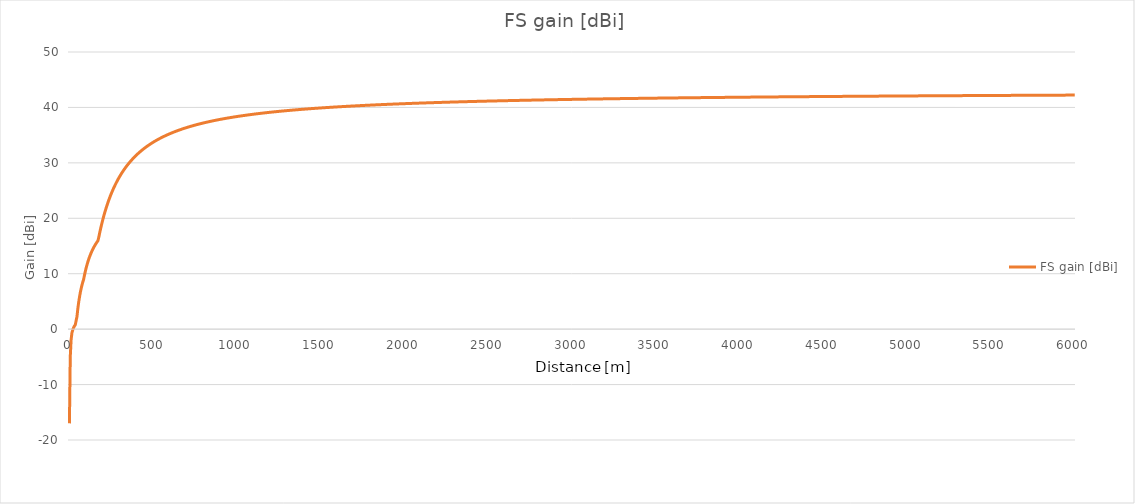
| Category | FS gain [dBi] |
|---|---|
| 0.0 | -17 |
| 5.0 | -5.017 |
| 10.0 | -1.946 |
| 15.0 | -0.667 |
| 20.0 | -0.125 |
| 25.0 | 0.269 |
| 30.0 | 0.562 |
| 35.0 | 0.787 |
| 40.0 | 0.963 |
| 45.0 | 2.252 |
| 50.0 | 3.641 |
| 55.0 | 4.796 |
| 60.0 | 5.771 |
| 65.0 | 6.604 |
| 70.0 | 7.324 |
| 75.0 | 7.952 |
| 80.0 | 8.504 |
| 85.0 | 8.994 |
| 90.0 | 9.753 |
| 95.0 | 10.438 |
| 100.0 | 11.057 |
| 105.0 | 11.618 |
| 110.0 | 12.129 |
| 115.0 | 12.596 |
| 120.0 | 13.025 |
| 125.0 | 13.42 |
| 130.0 | 13.785 |
| 135.0 | 14.124 |
| 140.0 | 14.438 |
| 145.0 | 14.731 |
| 150.0 | 15.005 |
| 155.0 | 15.261 |
| 160.0 | 15.502 |
| 165.0 | 15.728 |
| 170.0 | 15.941 |
| 175.0 | 16.545 |
| 180.0 | 17.276 |
| 185.0 | 17.968 |
| 190.0 | 18.624 |
| 195.0 | 19.247 |
| 200.0 | 19.839 |
| 205.0 | 20.401 |
| 210.0 | 20.938 |
| 215.0 | 21.449 |
| 220.0 | 21.937 |
| 225.0 | 22.404 |
| 230.0 | 22.85 |
| 235.0 | 23.278 |
| 240.0 | 23.688 |
| 245.0 | 24.081 |
| 250.0 | 24.458 |
| 255.0 | 24.821 |
| 260.0 | 25.17 |
| 265.0 | 25.506 |
| 270.0 | 25.829 |
| 275.0 | 26.14 |
| 280.0 | 26.441 |
| 285.0 | 26.731 |
| 290.0 | 27.011 |
| 295.0 | 27.281 |
| 300.0 | 27.543 |
| 305.0 | 27.796 |
| 310.0 | 28.041 |
| 315.0 | 28.278 |
| 320.0 | 28.508 |
| 325.0 | 28.73 |
| 330.0 | 28.946 |
| 335.0 | 29.156 |
| 340.0 | 29.359 |
| 345.0 | 29.556 |
| 350.0 | 29.748 |
| 355.0 | 29.935 |
| 360.0 | 30.116 |
| 365.0 | 30.292 |
| 370.0 | 30.464 |
| 375.0 | 30.631 |
| 380.0 | 30.793 |
| 385.0 | 30.952 |
| 390.0 | 31.106 |
| 395.0 | 31.256 |
| 400.0 | 31.403 |
| 405.0 | 31.546 |
| 410.0 | 31.686 |
| 415.0 | 31.822 |
| 420.0 | 31.955 |
| 425.0 | 32.085 |
| 430.0 | 32.211 |
| 435.0 | 32.335 |
| 440.0 | 32.456 |
| 445.0 | 32.575 |
| 450.0 | 32.691 |
| 455.0 | 32.804 |
| 460.0 | 32.915 |
| 465.0 | 33.023 |
| 470.0 | 33.129 |
| 475.0 | 33.233 |
| 480.0 | 33.334 |
| 485.0 | 33.434 |
| 490.0 | 33.532 |
| 495.0 | 33.627 |
| 500.0 | 33.721 |
| 505.0 | 33.813 |
| 510.0 | 33.903 |
| 515.0 | 33.991 |
| 520.0 | 34.078 |
| 525.0 | 34.162 |
| 530.0 | 34.246 |
| 535.0 | 34.328 |
| 540.0 | 34.408 |
| 545.0 | 34.487 |
| 550.0 | 34.564 |
| 555.0 | 34.64 |
| 560.0 | 34.715 |
| 565.0 | 34.788 |
| 570.0 | 34.86 |
| 575.0 | 34.931 |
| 580.0 | 35 |
| 585.0 | 35.068 |
| 590.0 | 35.136 |
| 595.0 | 35.202 |
| 600.0 | 35.267 |
| 605.0 | 35.331 |
| 610.0 | 35.393 |
| 615.0 | 35.455 |
| 620.0 | 35.516 |
| 625.0 | 35.576 |
| 630.0 | 35.635 |
| 635.0 | 35.693 |
| 640.0 | 35.75 |
| 645.0 | 35.806 |
| 650.0 | 35.861 |
| 655.0 | 35.916 |
| 660.0 | 35.969 |
| 665.0 | 36.022 |
| 670.0 | 36.074 |
| 675.0 | 36.126 |
| 680.0 | 36.176 |
| 685.0 | 36.226 |
| 690.0 | 36.275 |
| 695.0 | 36.323 |
| 700.0 | 36.371 |
| 705.0 | 36.418 |
| 710.0 | 36.464 |
| 715.0 | 36.51 |
| 720.0 | 36.555 |
| 725.0 | 36.6 |
| 730.0 | 36.643 |
| 735.0 | 36.687 |
| 740.0 | 36.729 |
| 745.0 | 36.771 |
| 750.0 | 36.813 |
| 755.0 | 36.854 |
| 760.0 | 36.894 |
| 765.0 | 36.934 |
| 770.0 | 36.974 |
| 775.0 | 37.012 |
| 780.0 | 37.051 |
| 785.0 | 37.089 |
| 790.0 | 37.126 |
| 795.0 | 37.163 |
| 800.0 | 37.199 |
| 805.0 | 37.236 |
| 810.0 | 37.271 |
| 815.0 | 37.306 |
| 820.0 | 37.341 |
| 825.0 | 37.375 |
| 830.0 | 37.409 |
| 835.0 | 37.443 |
| 840.0 | 37.476 |
| 845.0 | 37.508 |
| 850.0 | 37.541 |
| 855.0 | 37.573 |
| 860.0 | 37.604 |
| 865.0 | 37.635 |
| 870.0 | 37.666 |
| 875.0 | 37.697 |
| 880.0 | 37.727 |
| 885.0 | 37.756 |
| 890.0 | 37.786 |
| 895.0 | 37.815 |
| 900.0 | 37.844 |
| 905.0 | 37.872 |
| 910.0 | 37.901 |
| 915.0 | 37.928 |
| 920.0 | 37.956 |
| 925.0 | 37.983 |
| 930.0 | 38.01 |
| 935.0 | 38.037 |
| 940.0 | 38.063 |
| 945.0 | 38.089 |
| 950.0 | 38.115 |
| 955.0 | 38.141 |
| 960.0 | 38.166 |
| 965.0 | 38.191 |
| 970.0 | 38.216 |
| 975.0 | 38.24 |
| 980.0 | 38.265 |
| 985.0 | 38.289 |
| 990.0 | 38.313 |
| 995.0 | 38.336 |
| 1000.0 | 38.359 |
| 1005.0 | 38.382 |
| 1010.0 | 38.405 |
| 1015.0 | 38.428 |
| 1020.0 | 38.45 |
| 1025.0 | 38.473 |
| 1030.0 | 38.495 |
| 1035.0 | 38.516 |
| 1040.0 | 38.538 |
| 1045.0 | 38.559 |
| 1050.0 | 38.58 |
| 1055.0 | 38.601 |
| 1060.0 | 38.622 |
| 1065.0 | 38.643 |
| 1070.0 | 38.663 |
| 1075.0 | 38.683 |
| 1080.0 | 38.703 |
| 1085.0 | 38.723 |
| 1090.0 | 38.743 |
| 1095.0 | 38.762 |
| 1100.0 | 38.781 |
| 1105.0 | 38.8 |
| 1110.0 | 38.819 |
| 1115.0 | 38.838 |
| 1120.0 | 38.857 |
| 1125.0 | 38.875 |
| 1130.0 | 38.893 |
| 1135.0 | 38.911 |
| 1140.0 | 38.929 |
| 1145.0 | 38.947 |
| 1150.0 | 38.965 |
| 1155.0 | 38.982 |
| 1160.0 | 38.999 |
| 1165.0 | 39.017 |
| 1170.0 | 39.034 |
| 1175.0 | 39.05 |
| 1180.0 | 39.067 |
| 1185.0 | 39.084 |
| 1190.0 | 39.1 |
| 1195.0 | 39.117 |
| 1200.0 | 39.133 |
| 1205.0 | 39.149 |
| 1210.0 | 39.165 |
| 1215.0 | 39.18 |
| 1220.0 | 39.196 |
| 1225.0 | 39.212 |
| 1230.0 | 39.227 |
| 1235.0 | 39.242 |
| 1240.0 | 39.257 |
| 1245.0 | 39.273 |
| 1250.0 | 39.287 |
| 1255.0 | 39.302 |
| 1260.0 | 39.317 |
| 1265.0 | 39.331 |
| 1270.0 | 39.346 |
| 1275.0 | 39.36 |
| 1280.0 | 39.374 |
| 1285.0 | 39.389 |
| 1290.0 | 39.403 |
| 1295.0 | 39.416 |
| 1300.0 | 39.43 |
| 1305.0 | 39.444 |
| 1310.0 | 39.457 |
| 1315.0 | 39.471 |
| 1320.0 | 39.484 |
| 1325.0 | 39.498 |
| 1330.0 | 39.511 |
| 1335.0 | 39.524 |
| 1340.0 | 39.537 |
| 1345.0 | 39.55 |
| 1350.0 | 39.562 |
| 1355.0 | 39.575 |
| 1360.0 | 39.588 |
| 1365.0 | 39.6 |
| 1370.0 | 39.613 |
| 1375.0 | 39.625 |
| 1380.0 | 39.637 |
| 1385.0 | 39.649 |
| 1390.0 | 39.661 |
| 1395.0 | 39.673 |
| 1400.0 | 39.685 |
| 1405.0 | 39.697 |
| 1410.0 | 39.709 |
| 1415.0 | 39.72 |
| 1420.0 | 39.732 |
| 1425.0 | 39.743 |
| 1430.0 | 39.755 |
| 1435.0 | 39.766 |
| 1440.0 | 39.777 |
| 1445.0 | 39.788 |
| 1450.0 | 39.799 |
| 1455.0 | 39.81 |
| 1460.0 | 39.821 |
| 1465.0 | 39.832 |
| 1470.0 | 39.843 |
| 1475.0 | 39.854 |
| 1480.0 | 39.864 |
| 1485.0 | 39.875 |
| 1490.0 | 39.885 |
| 1495.0 | 39.896 |
| 1500.0 | 39.906 |
| 1505.0 | 39.916 |
| 1510.0 | 39.927 |
| 1515.0 | 39.937 |
| 1520.0 | 39.947 |
| 1525.0 | 39.957 |
| 1530.0 | 39.967 |
| 1535.0 | 39.977 |
| 1540.0 | 39.986 |
| 1545.0 | 39.996 |
| 1550.0 | 40.006 |
| 1555.0 | 40.016 |
| 1560.0 | 40.025 |
| 1565.0 | 40.035 |
| 1570.0 | 40.044 |
| 1575.0 | 40.053 |
| 1580.0 | 40.063 |
| 1585.0 | 40.072 |
| 1590.0 | 40.081 |
| 1595.0 | 40.09 |
| 1600.0 | 40.099 |
| 1605.0 | 40.109 |
| 1610.0 | 40.118 |
| 1615.0 | 40.126 |
| 1620.0 | 40.135 |
| 1625.0 | 40.144 |
| 1630.0 | 40.153 |
| 1635.0 | 40.162 |
| 1640.0 | 40.17 |
| 1645.0 | 40.179 |
| 1650.0 | 40.187 |
| 1655.0 | 40.196 |
| 1660.0 | 40.204 |
| 1665.0 | 40.213 |
| 1670.0 | 40.221 |
| 1675.0 | 40.229 |
| 1680.0 | 40.238 |
| 1685.0 | 40.246 |
| 1690.0 | 40.254 |
| 1695.0 | 40.262 |
| 1700.0 | 40.27 |
| 1705.0 | 40.278 |
| 1710.0 | 40.286 |
| 1715.0 | 40.294 |
| 1720.0 | 40.302 |
| 1725.0 | 40.31 |
| 1730.0 | 40.317 |
| 1735.0 | 40.325 |
| 1740.0 | 40.333 |
| 1745.0 | 40.34 |
| 1750.0 | 40.348 |
| 1755.0 | 40.356 |
| 1760.0 | 40.363 |
| 1765.0 | 40.371 |
| 1770.0 | 40.378 |
| 1775.0 | 40.385 |
| 1780.0 | 40.393 |
| 1785.0 | 40.4 |
| 1790.0 | 40.407 |
| 1795.0 | 40.415 |
| 1800.0 | 40.422 |
| 1805.0 | 40.429 |
| 1810.0 | 40.436 |
| 1815.0 | 40.443 |
| 1820.0 | 40.45 |
| 1825.0 | 40.457 |
| 1830.0 | 40.464 |
| 1835.0 | 40.471 |
| 1840.0 | 40.478 |
| 1845.0 | 40.485 |
| 1850.0 | 40.491 |
| 1855.0 | 40.498 |
| 1860.0 | 40.505 |
| 1865.0 | 40.512 |
| 1870.0 | 40.518 |
| 1875.0 | 40.525 |
| 1880.0 | 40.531 |
| 1885.0 | 40.538 |
| 1890.0 | 40.545 |
| 1895.0 | 40.551 |
| 1900.0 | 40.557 |
| 1905.0 | 40.564 |
| 1910.0 | 40.57 |
| 1915.0 | 40.577 |
| 1920.0 | 40.583 |
| 1925.0 | 40.589 |
| 1930.0 | 40.595 |
| 1935.0 | 40.602 |
| 1940.0 | 40.608 |
| 1945.0 | 40.614 |
| 1950.0 | 40.62 |
| 1955.0 | 40.626 |
| 1960.0 | 40.632 |
| 1965.0 | 40.638 |
| 1970.0 | 40.644 |
| 1975.0 | 40.65 |
| 1980.0 | 40.656 |
| 1985.0 | 40.662 |
| 1990.0 | 40.668 |
| 1995.0 | 40.674 |
| 2000.0 | 40.68 |
| 2005.0 | 40.685 |
| 2010.0 | 40.691 |
| 2015.0 | 40.697 |
| 2020.0 | 40.703 |
| 2025.0 | 40.708 |
| 2030.0 | 40.714 |
| 2035.0 | 40.719 |
| 2040.0 | 40.725 |
| 2045.0 | 40.731 |
| 2050.0 | 40.736 |
| 2055.0 | 40.742 |
| 2060.0 | 40.747 |
| 2065.0 | 40.753 |
| 2070.0 | 40.758 |
| 2075.0 | 40.763 |
| 2080.0 | 40.769 |
| 2085.0 | 40.774 |
| 2090.0 | 40.779 |
| 2095.0 | 40.785 |
| 2100.0 | 40.79 |
| 2105.0 | 40.795 |
| 2110.0 | 40.801 |
| 2115.0 | 40.806 |
| 2120.0 | 40.811 |
| 2125.0 | 40.816 |
| 2130.0 | 40.821 |
| 2135.0 | 40.826 |
| 2140.0 | 40.831 |
| 2145.0 | 40.836 |
| 2150.0 | 40.841 |
| 2155.0 | 40.846 |
| 2160.0 | 40.851 |
| 2165.0 | 40.856 |
| 2170.0 | 40.861 |
| 2175.0 | 40.866 |
| 2180.0 | 40.871 |
| 2185.0 | 40.876 |
| 2190.0 | 40.881 |
| 2195.0 | 40.886 |
| 2200.0 | 40.891 |
| 2205.0 | 40.895 |
| 2210.0 | 40.9 |
| 2215.0 | 40.905 |
| 2220.0 | 40.91 |
| 2225.0 | 40.914 |
| 2230.0 | 40.919 |
| 2235.0 | 40.924 |
| 2240.0 | 40.928 |
| 2245.0 | 40.933 |
| 2250.0 | 40.937 |
| 2255.0 | 40.942 |
| 2260.0 | 40.947 |
| 2265.0 | 40.951 |
| 2270.0 | 40.956 |
| 2275.0 | 40.96 |
| 2280.0 | 40.965 |
| 2285.0 | 40.969 |
| 2290.0 | 40.973 |
| 2295.0 | 40.978 |
| 2300.0 | 40.982 |
| 2305.0 | 40.987 |
| 2310.0 | 40.991 |
| 2315.0 | 40.995 |
| 2320.0 | 41 |
| 2325.0 | 41.004 |
| 2330.0 | 41.008 |
| 2335.0 | 41.012 |
| 2340.0 | 41.017 |
| 2345.0 | 41.021 |
| 2350.0 | 41.025 |
| 2355.0 | 41.029 |
| 2360.0 | 41.034 |
| 2365.0 | 41.038 |
| 2370.0 | 41.042 |
| 2375.0 | 41.046 |
| 2380.0 | 41.05 |
| 2385.0 | 41.054 |
| 2390.0 | 41.058 |
| 2395.0 | 41.062 |
| 2400.0 | 41.066 |
| 2405.0 | 41.07 |
| 2410.0 | 41.074 |
| 2415.0 | 41.078 |
| 2420.0 | 41.082 |
| 2425.0 | 41.086 |
| 2430.0 | 41.09 |
| 2435.0 | 41.094 |
| 2440.0 | 41.098 |
| 2445.0 | 41.102 |
| 2450.0 | 41.106 |
| 2455.0 | 41.11 |
| 2460.0 | 41.113 |
| 2465.0 | 41.117 |
| 2470.0 | 41.121 |
| 2475.0 | 41.125 |
| 2480.0 | 41.129 |
| 2485.0 | 41.132 |
| 2490.0 | 41.136 |
| 2495.0 | 41.14 |
| 2500.0 | 41.144 |
| 2505.0 | 41.147 |
| 2510.0 | 41.151 |
| 2515.0 | 41.155 |
| 2520.0 | 41.158 |
| 2525.0 | 41.162 |
| 2530.0 | 41.166 |
| 2535.0 | 41.169 |
| 2540.0 | 41.173 |
| 2545.0 | 41.176 |
| 2550.0 | 41.18 |
| 2555.0 | 41.184 |
| 2560.0 | 41.187 |
| 2565.0 | 41.191 |
| 2570.0 | 41.194 |
| 2575.0 | 41.198 |
| 2580.0 | 41.201 |
| 2585.0 | 41.205 |
| 2590.0 | 41.208 |
| 2595.0 | 41.212 |
| 2600.0 | 41.215 |
| 2605.0 | 41.218 |
| 2610.0 | 41.222 |
| 2615.0 | 41.225 |
| 2620.0 | 41.229 |
| 2625.0 | 41.232 |
| 2630.0 | 41.235 |
| 2635.0 | 41.239 |
| 2640.0 | 41.242 |
| 2645.0 | 41.245 |
| 2650.0 | 41.249 |
| 2655.0 | 41.252 |
| 2660.0 | 41.255 |
| 2665.0 | 41.259 |
| 2670.0 | 41.262 |
| 2675.0 | 41.265 |
| 2680.0 | 41.268 |
| 2685.0 | 41.272 |
| 2690.0 | 41.275 |
| 2695.0 | 41.278 |
| 2700.0 | 41.281 |
| 2705.0 | 41.284 |
| 2710.0 | 41.287 |
| 2715.0 | 41.291 |
| 2720.0 | 41.294 |
| 2725.0 | 41.297 |
| 2730.0 | 41.3 |
| 2735.0 | 41.303 |
| 2740.0 | 41.306 |
| 2745.0 | 41.309 |
| 2750.0 | 41.312 |
| 2755.0 | 41.315 |
| 2760.0 | 41.319 |
| 2765.0 | 41.322 |
| 2770.0 | 41.325 |
| 2775.0 | 41.328 |
| 2780.0 | 41.331 |
| 2785.0 | 41.334 |
| 2790.0 | 41.337 |
| 2795.0 | 41.34 |
| 2800.0 | 41.343 |
| 2805.0 | 41.345 |
| 2810.0 | 41.348 |
| 2815.0 | 41.351 |
| 2820.0 | 41.354 |
| 2825.0 | 41.357 |
| 2830.0 | 41.36 |
| 2835.0 | 41.363 |
| 2840.0 | 41.366 |
| 2845.0 | 41.369 |
| 2850.0 | 41.372 |
| 2855.0 | 41.374 |
| 2860.0 | 41.377 |
| 2865.0 | 41.38 |
| 2870.0 | 41.383 |
| 2875.0 | 41.386 |
| 2880.0 | 41.389 |
| 2885.0 | 41.391 |
| 2890.0 | 41.394 |
| 2895.0 | 41.397 |
| 2900.0 | 41.4 |
| 2905.0 | 41.402 |
| 2910.0 | 41.405 |
| 2915.0 | 41.408 |
| 2920.0 | 41.411 |
| 2925.0 | 41.413 |
| 2930.0 | 41.416 |
| 2935.0 | 41.419 |
| 2940.0 | 41.421 |
| 2945.0 | 41.424 |
| 2950.0 | 41.427 |
| 2955.0 | 41.429 |
| 2960.0 | 41.432 |
| 2965.0 | 41.435 |
| 2970.0 | 41.437 |
| 2975.0 | 41.44 |
| 2980.0 | 41.443 |
| 2985.0 | 41.445 |
| 2990.0 | 41.448 |
| 2995.0 | 41.45 |
| 3000.0 | 41.453 |
| 3005.0 | 41.456 |
| 3010.0 | 41.458 |
| 3015.0 | 41.461 |
| 3020.0 | 41.463 |
| 3025.0 | 41.466 |
| 3030.0 | 41.468 |
| 3035.0 | 41.471 |
| 3040.0 | 41.473 |
| 3045.0 | 41.476 |
| 3050.0 | 41.478 |
| 3055.0 | 41.481 |
| 3060.0 | 41.483 |
| 3065.0 | 41.486 |
| 3070.0 | 41.488 |
| 3075.0 | 41.491 |
| 3080.0 | 41.493 |
| 3085.0 | 41.496 |
| 3090.0 | 41.498 |
| 3095.0 | 41.501 |
| 3100.0 | 41.503 |
| 3105.0 | 41.505 |
| 3110.0 | 41.508 |
| 3115.0 | 41.51 |
| 3120.0 | 41.513 |
| 3125.0 | 41.515 |
| 3130.0 | 41.517 |
| 3135.0 | 41.52 |
| 3140.0 | 41.522 |
| 3145.0 | 41.524 |
| 3150.0 | 41.527 |
| 3155.0 | 41.529 |
| 3160.0 | 41.531 |
| 3165.0 | 41.534 |
| 3170.0 | 41.536 |
| 3175.0 | 41.538 |
| 3180.0 | 41.541 |
| 3185.0 | 41.543 |
| 3190.0 | 41.545 |
| 3195.0 | 41.547 |
| 3200.0 | 41.55 |
| 3205.0 | 41.552 |
| 3210.0 | 41.554 |
| 3215.0 | 41.556 |
| 3220.0 | 41.559 |
| 3225.0 | 41.561 |
| 3230.0 | 41.563 |
| 3235.0 | 41.565 |
| 3240.0 | 41.568 |
| 3245.0 | 41.57 |
| 3250.0 | 41.572 |
| 3255.0 | 41.574 |
| 3260.0 | 41.576 |
| 3265.0 | 41.579 |
| 3270.0 | 41.581 |
| 3275.0 | 41.583 |
| 3280.0 | 41.585 |
| 3285.0 | 41.587 |
| 3290.0 | 41.589 |
| 3295.0 | 41.592 |
| 3300.0 | 41.594 |
| 3305.0 | 41.596 |
| 3310.0 | 41.598 |
| 3315.0 | 41.6 |
| 3320.0 | 41.602 |
| 3325.0 | 41.604 |
| 3330.0 | 41.606 |
| 3335.0 | 41.608 |
| 3340.0 | 41.611 |
| 3345.0 | 41.613 |
| 3350.0 | 41.615 |
| 3355.0 | 41.617 |
| 3360.0 | 41.619 |
| 3365.0 | 41.621 |
| 3370.0 | 41.623 |
| 3375.0 | 41.625 |
| 3380.0 | 41.627 |
| 3385.0 | 41.629 |
| 3390.0 | 41.631 |
| 3395.0 | 41.633 |
| 3400.0 | 41.635 |
| 3405.0 | 41.637 |
| 3410.0 | 41.639 |
| 3415.0 | 41.641 |
| 3420.0 | 41.643 |
| 3425.0 | 41.645 |
| 3430.0 | 41.647 |
| 3435.0 | 41.649 |
| 3440.0 | 41.651 |
| 3445.0 | 41.653 |
| 3450.0 | 41.655 |
| 3455.0 | 41.657 |
| 3460.0 | 41.659 |
| 3465.0 | 41.661 |
| 3470.0 | 41.663 |
| 3475.0 | 41.664 |
| 3480.0 | 41.666 |
| 3485.0 | 41.668 |
| 3490.0 | 41.67 |
| 3495.0 | 41.672 |
| 3500.0 | 41.674 |
| 3505.0 | 41.676 |
| 3510.0 | 41.678 |
| 3515.0 | 41.68 |
| 3520.0 | 41.682 |
| 3525.0 | 41.683 |
| 3530.0 | 41.685 |
| 3535.0 | 41.687 |
| 3540.0 | 41.689 |
| 3545.0 | 41.691 |
| 3550.0 | 41.693 |
| 3555.0 | 41.695 |
| 3560.0 | 41.696 |
| 3565.0 | 41.698 |
| 3570.0 | 41.7 |
| 3575.0 | 41.702 |
| 3580.0 | 41.704 |
| 3585.0 | 41.705 |
| 3590.0 | 41.707 |
| 3595.0 | 41.709 |
| 3600.0 | 41.711 |
| 3605.0 | 41.713 |
| 3610.0 | 41.714 |
| 3615.0 | 41.716 |
| 3620.0 | 41.718 |
| 3625.0 | 41.72 |
| 3630.0 | 41.722 |
| 3635.0 | 41.723 |
| 3640.0 | 41.725 |
| 3645.0 | 41.727 |
| 3650.0 | 41.729 |
| 3655.0 | 41.73 |
| 3660.0 | 41.732 |
| 3665.0 | 41.734 |
| 3670.0 | 41.735 |
| 3675.0 | 41.737 |
| 3680.0 | 41.739 |
| 3685.0 | 41.741 |
| 3690.0 | 41.742 |
| 3695.0 | 41.744 |
| 3700.0 | 41.746 |
| 3705.0 | 41.747 |
| 3710.0 | 41.749 |
| 3715.0 | 41.751 |
| 3720.0 | 41.752 |
| 3725.0 | 41.754 |
| 3730.0 | 41.756 |
| 3735.0 | 41.757 |
| 3740.0 | 41.759 |
| 3745.0 | 41.761 |
| 3750.0 | 41.762 |
| 3755.0 | 41.764 |
| 3760.0 | 41.766 |
| 3765.0 | 41.767 |
| 3770.0 | 41.769 |
| 3775.0 | 41.771 |
| 3780.0 | 41.772 |
| 3785.0 | 41.774 |
| 3790.0 | 41.775 |
| 3795.0 | 41.777 |
| 3800.0 | 41.779 |
| 3805.0 | 41.78 |
| 3810.0 | 41.782 |
| 3815.0 | 41.784 |
| 3820.0 | 41.785 |
| 3825.0 | 41.787 |
| 3830.0 | 41.788 |
| 3835.0 | 41.79 |
| 3840.0 | 41.791 |
| 3845.0 | 41.793 |
| 3850.0 | 41.795 |
| 3855.0 | 41.796 |
| 3860.0 | 41.798 |
| 3865.0 | 41.799 |
| 3870.0 | 41.801 |
| 3875.0 | 41.802 |
| 3880.0 | 41.804 |
| 3885.0 | 41.805 |
| 3890.0 | 41.807 |
| 3895.0 | 41.808 |
| 3900.0 | 41.81 |
| 3905.0 | 41.812 |
| 3910.0 | 41.813 |
| 3915.0 | 41.815 |
| 3920.0 | 41.816 |
| 3925.0 | 41.818 |
| 3930.0 | 41.819 |
| 3935.0 | 41.821 |
| 3940.0 | 41.822 |
| 3945.0 | 41.824 |
| 3950.0 | 41.825 |
| 3955.0 | 41.827 |
| 3960.0 | 41.828 |
| 3965.0 | 41.83 |
| 3970.0 | 41.831 |
| 3975.0 | 41.832 |
| 3980.0 | 41.834 |
| 3985.0 | 41.835 |
| 3990.0 | 41.837 |
| 3995.0 | 41.838 |
| 4000.0 | 41.84 |
| 4005.0 | 41.841 |
| 4010.0 | 41.843 |
| 4015.0 | 41.844 |
| 4020.0 | 41.846 |
| 4025.0 | 41.847 |
| 4030.0 | 41.848 |
| 4035.0 | 41.85 |
| 4040.0 | 41.851 |
| 4045.0 | 41.853 |
| 4050.0 | 41.854 |
| 4055.0 | 41.856 |
| 4060.0 | 41.857 |
| 4065.0 | 41.858 |
| 4070.0 | 41.86 |
| 4075.0 | 41.861 |
| 4080.0 | 41.863 |
| 4085.0 | 41.864 |
| 4090.0 | 41.865 |
| 4095.0 | 41.867 |
| 4100.0 | 41.868 |
| 4105.0 | 41.869 |
| 4110.0 | 41.871 |
| 4115.0 | 41.872 |
| 4120.0 | 41.874 |
| 4125.0 | 41.875 |
| 4130.0 | 41.876 |
| 4135.0 | 41.878 |
| 4140.0 | 41.879 |
| 4145.0 | 41.88 |
| 4150.0 | 41.882 |
| 4155.0 | 41.883 |
| 4160.0 | 41.884 |
| 4165.0 | 41.886 |
| 4170.0 | 41.887 |
| 4175.0 | 41.888 |
| 4180.0 | 41.89 |
| 4185.0 | 41.891 |
| 4190.0 | 41.892 |
| 4195.0 | 41.894 |
| 4200.0 | 41.895 |
| 4205.0 | 41.896 |
| 4210.0 | 41.898 |
| 4215.0 | 41.899 |
| 4220.0 | 41.9 |
| 4225.0 | 41.902 |
| 4230.0 | 41.903 |
| 4235.0 | 41.904 |
| 4240.0 | 41.905 |
| 4245.0 | 41.907 |
| 4250.0 | 41.908 |
| 4255.0 | 41.909 |
| 4260.0 | 41.911 |
| 4265.0 | 41.912 |
| 4270.0 | 41.913 |
| 4275.0 | 41.914 |
| 4280.0 | 41.916 |
| 4285.0 | 41.917 |
| 4290.0 | 41.918 |
| 4295.0 | 41.919 |
| 4300.0 | 41.921 |
| 4305.0 | 41.922 |
| 4310.0 | 41.923 |
| 4315.0 | 41.924 |
| 4320.0 | 41.926 |
| 4325.0 | 41.927 |
| 4330.0 | 41.928 |
| 4335.0 | 41.929 |
| 4340.0 | 41.931 |
| 4345.0 | 41.932 |
| 4350.0 | 41.933 |
| 4355.0 | 41.934 |
| 4360.0 | 41.936 |
| 4365.0 | 41.937 |
| 4370.0 | 41.938 |
| 4375.0 | 41.939 |
| 4380.0 | 41.94 |
| 4385.0 | 41.942 |
| 4390.0 | 41.943 |
| 4395.0 | 41.944 |
| 4400.0 | 41.945 |
| 4405.0 | 41.946 |
| 4410.0 | 41.948 |
| 4415.0 | 41.949 |
| 4420.0 | 41.95 |
| 4425.0 | 41.951 |
| 4430.0 | 41.952 |
| 4435.0 | 41.954 |
| 4440.0 | 41.955 |
| 4445.0 | 41.956 |
| 4450.0 | 41.957 |
| 4455.0 | 41.958 |
| 4460.0 | 41.959 |
| 4465.0 | 41.961 |
| 4470.0 | 41.962 |
| 4475.0 | 41.963 |
| 4480.0 | 41.964 |
| 4485.0 | 41.965 |
| 4490.0 | 41.966 |
| 4495.0 | 41.968 |
| 4500.0 | 41.969 |
| 4505.0 | 41.97 |
| 4510.0 | 41.971 |
| 4515.0 | 41.972 |
| 4520.0 | 41.973 |
| 4525.0 | 41.974 |
| 4530.0 | 41.976 |
| 4535.0 | 41.977 |
| 4540.0 | 41.978 |
| 4545.0 | 41.979 |
| 4550.0 | 41.98 |
| 4555.0 | 41.981 |
| 4560.0 | 41.982 |
| 4565.0 | 41.983 |
| 4570.0 | 41.984 |
| 4575.0 | 41.986 |
| 4580.0 | 41.987 |
| 4585.0 | 41.988 |
| 4590.0 | 41.989 |
| 4595.0 | 41.99 |
| 4600.0 | 41.991 |
| 4605.0 | 41.992 |
| 4610.0 | 41.993 |
| 4615.0 | 41.994 |
| 4620.0 | 41.995 |
| 4625.0 | 41.997 |
| 4630.0 | 41.998 |
| 4635.0 | 41.999 |
| 4640.0 | 42 |
| 4645.0 | 42.001 |
| 4650.0 | 42.002 |
| 4655.0 | 42.003 |
| 4660.0 | 42.004 |
| 4665.0 | 42.005 |
| 4670.0 | 42.006 |
| 4675.0 | 42.007 |
| 4680.0 | 42.008 |
| 4685.0 | 42.009 |
| 4690.0 | 42.01 |
| 4695.0 | 42.012 |
| 4700.0 | 42.013 |
| 4705.0 | 42.014 |
| 4710.0 | 42.015 |
| 4715.0 | 42.016 |
| 4720.0 | 42.017 |
| 4725.0 | 42.018 |
| 4730.0 | 42.019 |
| 4735.0 | 42.02 |
| 4740.0 | 42.021 |
| 4745.0 | 42.022 |
| 4750.0 | 42.023 |
| 4755.0 | 42.024 |
| 4760.0 | 42.025 |
| 4765.0 | 42.026 |
| 4770.0 | 42.027 |
| 4775.0 | 42.028 |
| 4780.0 | 42.029 |
| 4785.0 | 42.03 |
| 4790.0 | 42.031 |
| 4795.0 | 42.032 |
| 4800.0 | 42.033 |
| 4805.0 | 42.034 |
| 4810.0 | 42.035 |
| 4815.0 | 42.036 |
| 4820.0 | 42.037 |
| 4825.0 | 42.038 |
| 4830.0 | 42.039 |
| 4835.0 | 42.04 |
| 4840.0 | 42.041 |
| 4845.0 | 42.042 |
| 4850.0 | 42.043 |
| 4855.0 | 42.044 |
| 4860.0 | 42.045 |
| 4865.0 | 42.046 |
| 4870.0 | 42.047 |
| 4875.0 | 42.048 |
| 4880.0 | 42.049 |
| 4885.0 | 42.05 |
| 4890.0 | 42.051 |
| 4895.0 | 42.052 |
| 4900.0 | 42.053 |
| 4905.0 | 42.054 |
| 4910.0 | 42.055 |
| 4915.0 | 42.056 |
| 4920.0 | 42.057 |
| 4925.0 | 42.058 |
| 4930.0 | 42.059 |
| 4935.0 | 42.06 |
| 4940.0 | 42.061 |
| 4945.0 | 42.061 |
| 4950.0 | 42.062 |
| 4955.0 | 42.063 |
| 4960.0 | 42.064 |
| 4965.0 | 42.065 |
| 4970.0 | 42.066 |
| 4975.0 | 42.067 |
| 4980.0 | 42.068 |
| 4985.0 | 42.069 |
| 4990.0 | 42.07 |
| 4995.0 | 42.071 |
| 5000.0 | 42.072 |
| 5005.0 | 42.073 |
| 5010.0 | 42.074 |
| 5015.0 | 42.075 |
| 5020.0 | 42.076 |
| 5025.0 | 42.076 |
| 5030.0 | 42.077 |
| 5035.0 | 42.078 |
| 5040.0 | 42.079 |
| 5045.0 | 42.08 |
| 5050.0 | 42.081 |
| 5055.0 | 42.082 |
| 5060.0 | 42.083 |
| 5065.0 | 42.084 |
| 5070.0 | 42.085 |
| 5075.0 | 42.086 |
| 5080.0 | 42.086 |
| 5085.0 | 42.087 |
| 5090.0 | 42.088 |
| 5095.0 | 42.089 |
| 5100.0 | 42.09 |
| 5105.0 | 42.091 |
| 5110.0 | 42.092 |
| 5115.0 | 42.093 |
| 5120.0 | 42.094 |
| 5125.0 | 42.094 |
| 5130.0 | 42.095 |
| 5135.0 | 42.096 |
| 5140.0 | 42.097 |
| 5145.0 | 42.098 |
| 5150.0 | 42.099 |
| 5155.0 | 42.1 |
| 5160.0 | 42.101 |
| 5165.0 | 42.101 |
| 5170.0 | 42.102 |
| 5175.0 | 42.103 |
| 5180.0 | 42.104 |
| 5185.0 | 42.105 |
| 5190.0 | 42.106 |
| 5195.0 | 42.107 |
| 5200.0 | 42.108 |
| 5205.0 | 42.108 |
| 5210.0 | 42.109 |
| 5215.0 | 42.11 |
| 5220.0 | 42.111 |
| 5225.0 | 42.112 |
| 5230.0 | 42.113 |
| 5235.0 | 42.113 |
| 5240.0 | 42.114 |
| 5245.0 | 42.115 |
| 5250.0 | 42.116 |
| 5255.0 | 42.117 |
| 5260.0 | 42.118 |
| 5265.0 | 42.119 |
| 5270.0 | 42.119 |
| 5275.0 | 42.12 |
| 5280.0 | 42.121 |
| 5285.0 | 42.122 |
| 5290.0 | 42.123 |
| 5295.0 | 42.124 |
| 5300.0 | 42.124 |
| 5305.0 | 42.125 |
| 5310.0 | 42.126 |
| 5315.0 | 42.127 |
| 5320.0 | 42.128 |
| 5325.0 | 42.128 |
| 5330.0 | 42.129 |
| 5335.0 | 42.13 |
| 5340.0 | 42.131 |
| 5345.0 | 42.132 |
| 5350.0 | 42.133 |
| 5355.0 | 42.133 |
| 5360.0 | 42.134 |
| 5365.0 | 42.135 |
| 5370.0 | 42.136 |
| 5375.0 | 42.137 |
| 5380.0 | 42.137 |
| 5385.0 | 42.138 |
| 5390.0 | 42.139 |
| 5395.0 | 42.14 |
| 5400.0 | 42.141 |
| 5405.0 | 42.141 |
| 5410.0 | 42.142 |
| 5415.0 | 42.143 |
| 5420.0 | 42.144 |
| 5425.0 | 42.145 |
| 5430.0 | 42.145 |
| 5435.0 | 42.146 |
| 5440.0 | 42.147 |
| 5445.0 | 42.148 |
| 5450.0 | 42.148 |
| 5455.0 | 42.149 |
| 5460.0 | 42.15 |
| 5465.0 | 42.151 |
| 5470.0 | 42.152 |
| 5475.0 | 42.152 |
| 5480.0 | 42.153 |
| 5485.0 | 42.154 |
| 5490.0 | 42.155 |
| 5495.0 | 42.155 |
| 5500.0 | 42.156 |
| 5505.0 | 42.157 |
| 5510.0 | 42.158 |
| 5515.0 | 42.158 |
| 5520.0 | 42.159 |
| 5525.0 | 42.16 |
| 5530.0 | 42.161 |
| 5535.0 | 42.162 |
| 5540.0 | 42.162 |
| 5545.0 | 42.163 |
| 5550.0 | 42.164 |
| 5555.0 | 42.165 |
| 5560.0 | 42.165 |
| 5565.0 | 42.166 |
| 5570.0 | 42.167 |
| 5575.0 | 42.168 |
| 5580.0 | 42.168 |
| 5585.0 | 42.169 |
| 5590.0 | 42.17 |
| 5595.0 | 42.171 |
| 5600.0 | 42.171 |
| 5605.0 | 42.172 |
| 5610.0 | 42.173 |
| 5615.0 | 42.173 |
| 5620.0 | 42.174 |
| 5625.0 | 42.175 |
| 5630.0 | 42.176 |
| 5635.0 | 42.176 |
| 5640.0 | 42.177 |
| 5645.0 | 42.178 |
| 5650.0 | 42.179 |
| 5655.0 | 42.179 |
| 5660.0 | 42.18 |
| 5665.0 | 42.181 |
| 5670.0 | 42.181 |
| 5675.0 | 42.182 |
| 5680.0 | 42.183 |
| 5685.0 | 42.184 |
| 5690.0 | 42.184 |
| 5695.0 | 42.185 |
| 5700.0 | 42.186 |
| 5705.0 | 42.187 |
| 5710.0 | 42.187 |
| 5715.0 | 42.188 |
| 5720.0 | 42.189 |
| 5725.0 | 42.189 |
| 5730.0 | 42.19 |
| 5735.0 | 42.191 |
| 5740.0 | 42.191 |
| 5745.0 | 42.192 |
| 5750.0 | 42.193 |
| 5755.0 | 42.194 |
| 5760.0 | 42.194 |
| 5765.0 | 42.195 |
| 5770.0 | 42.196 |
| 5775.0 | 42.196 |
| 5780.0 | 42.197 |
| 5785.0 | 42.198 |
| 5790.0 | 42.198 |
| 5795.0 | 42.199 |
| 5800.0 | 42.2 |
| 5805.0 | 42.201 |
| 5810.0 | 42.201 |
| 5815.0 | 42.202 |
| 5820.0 | 42.203 |
| 5825.0 | 42.203 |
| 5830.0 | 42.204 |
| 5835.0 | 42.205 |
| 5840.0 | 42.205 |
| 5845.0 | 42.206 |
| 5850.0 | 42.207 |
| 5855.0 | 42.207 |
| 5860.0 | 42.208 |
| 5865.0 | 42.209 |
| 5870.0 | 42.209 |
| 5875.0 | 42.21 |
| 5880.0 | 42.211 |
| 5885.0 | 42.211 |
| 5890.0 | 42.212 |
| 5895.0 | 42.213 |
| 5900.0 | 42.213 |
| 5905.0 | 42.214 |
| 5910.0 | 42.215 |
| 5915.0 | 42.215 |
| 5920.0 | 42.216 |
| 5925.0 | 42.217 |
| 5930.0 | 42.217 |
| 5935.0 | 42.218 |
| 5940.0 | 42.219 |
| 5945.0 | 42.219 |
| 5950.0 | 42.22 |
| 5955.0 | 42.221 |
| 5960.0 | 42.221 |
| 5965.0 | 42.222 |
| 5970.0 | 42.223 |
| 5975.0 | 42.223 |
| 5980.0 | 42.224 |
| 5985.0 | 42.225 |
| 5990.0 | 42.225 |
| 5995.0 | 42.226 |
| 6000.0 | 42.227 |
| 6000.0 | 42.227 |